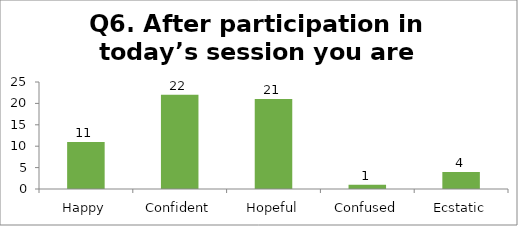
| Category | Q6. After participation in today’s session you are feeling? |
|---|---|
| Happy | 11 |
| Confident | 22 |
| Hopeful | 21 |
| Confused | 1 |
| Ecstatic | 4 |